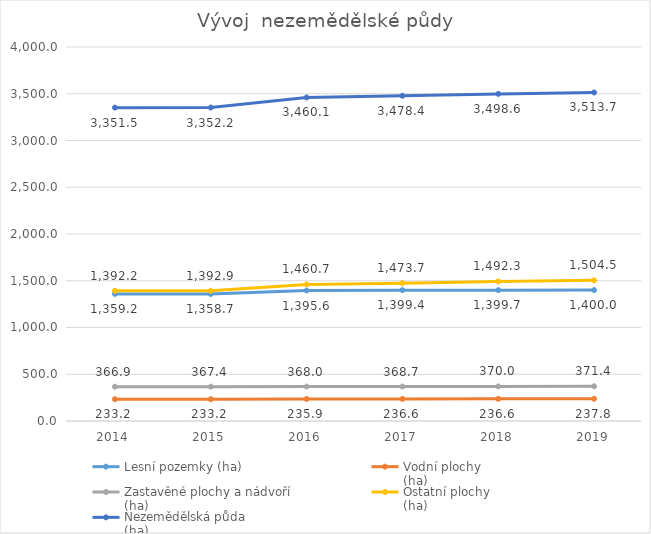
| Category | Lesní pozemky (ha) | Vodní plochy 
(ha) | Zastavěné plochy a nádvoří 
(ha) | Ostatní plochy 
(ha) | Nezemědělská půda 
(ha) |
|---|---|---|---|---|---|
| 2014.0 | 1359.248 | 233.2 | 366.853 | 1392.16 | 3351.462 |
| 2015.0 | 1358.712 | 233.199 | 367.363 | 1392.897 | 3352.172 |
| 2016.0 | 1395.576 | 235.895 | 367.979 | 1460.683 | 3460.133 |
| 2017.0 | 1399.424 | 236.63 | 368.727 | 1473.658 | 3478.439 |
| 2018.0 | 1399.725 | 236.644 | 369.956 | 1492.297 | 3498.622 |
| 2019.0 | 1399.994 | 237.846 | 371.36 | 1504.487 | 3513.687 |